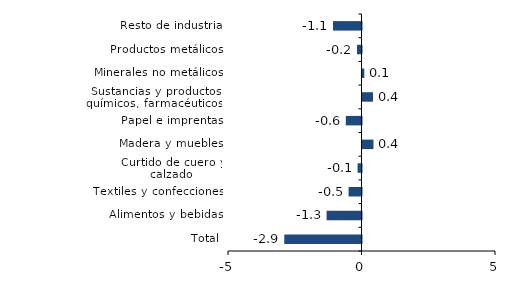
| Category | Series 0 |
|---|---|
| Total | -2.891 |
| Alimentos y bebidas | -1.308 |
| Textiles y confecciones | -0.484 |
| Curtido de cuero y calzado | -0.146 |
| Madera y muebles | 0.412 |
| Papel e imprentas | -0.588 |
| Sustancias y productos químicos, farmacéuticos, de caucho y plásticos | 0.393 |
| Minerales no metálicos | 0.068 |
| Productos metálicos | -0.169 |
| Resto de industria | -1.068 |